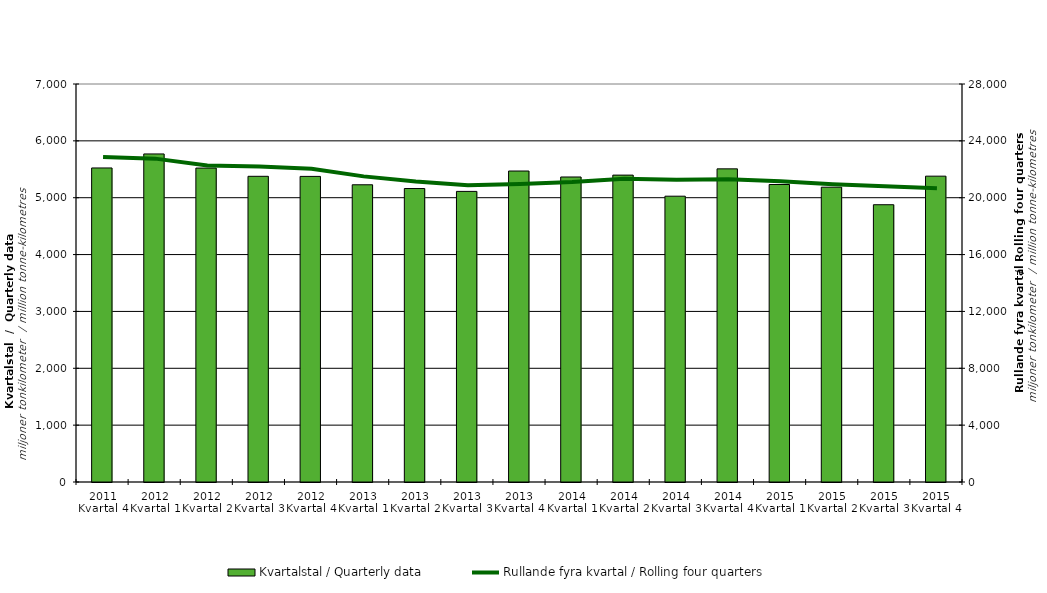
| Category | Kvartalstal / Quarterly data |
|---|---|
| 2011 Kvartal 4 | 5523.171 |
| 2012 Kvartal 1 | 5769.724 |
| 2012 Kvartal 2 | 5521.307 |
| 2012 Kvartal 3 | 5376.578 |
| 2012 Kvartal 4 | 5375.031 |
| 2013 Kvartal 1 | 5227.648 |
| 2013 Kvartal 2 | 5161.772 |
| 2013 Kvartal 3 | 5111.013 |
| 2013 Kvartal 4 | 5469.542 |
| 2014 Kvartal 1 | 5364.578 |
| 2014 Kvartal 2 | 5397.475 |
| 2014 Kvartal 3 | 5026.729 |
| 2014 Kvartal 4 | 5507.547 |
| 2015 Kvartal 1 | 5232.245 |
| 2015 Kvartal 2 | 5184.883 |
| 2015 Kvartal 3 | 4876.711 |
| 2015 Kvartal 4 | 5378.939 |